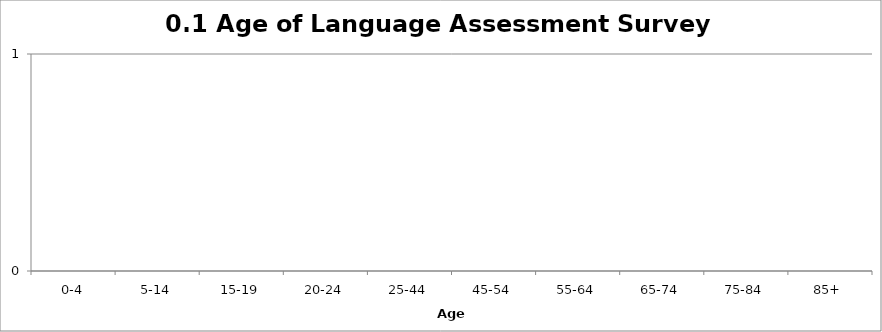
| Category | 0.1 Age of Language Assessment Survey participants |
|---|---|
| 0-4 | 0 |
| 5-14 | 0 |
| 15-19 | 0 |
| 20-24 | 0 |
| 25-44 | 0 |
| 45-54 | 0 |
| 55-64 | 0 |
| 65-74 | 0 |
| 75-84 | 0 |
| 85+ | 0 |